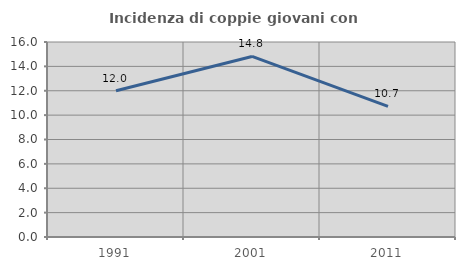
| Category | Incidenza di coppie giovani con figli |
|---|---|
| 1991.0 | 12 |
| 2001.0 | 14.815 |
| 2011.0 | 10.714 |